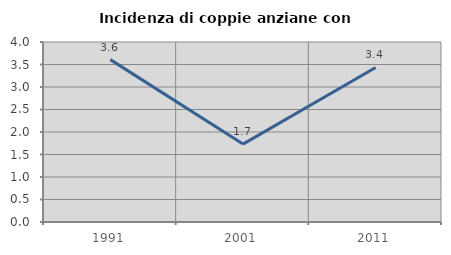
| Category | Incidenza di coppie anziane con figli |
|---|---|
| 1991.0 | 3.608 |
| 2001.0 | 1.732 |
| 2011.0 | 3.433 |